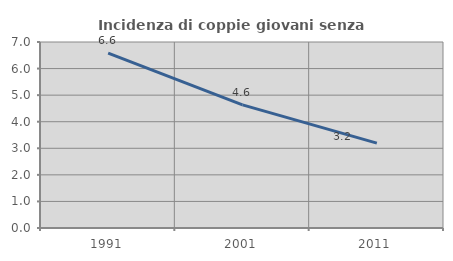
| Category | Incidenza di coppie giovani senza figli |
|---|---|
| 1991.0 | 6.581 |
| 2001.0 | 4.636 |
| 2011.0 | 3.195 |